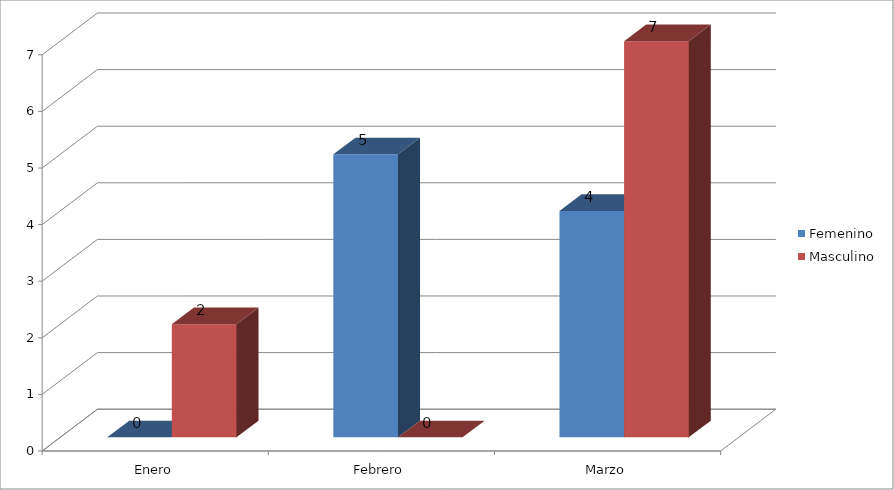
| Category | Femenino | Masculino |
|---|---|---|
| Enero | 0 | 2 |
| Febrero | 5 | 0 |
| Marzo | 4 | 7 |